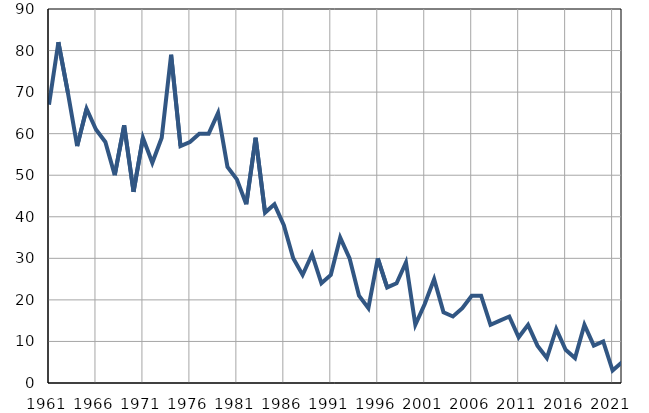
| Category | Умрла 
одојчад |
|---|---|
| 1961.0 | 67 |
| 1962.0 | 82 |
| 1963.0 | 70 |
| 1964.0 | 57 |
| 1965.0 | 66 |
| 1966.0 | 61 |
| 1967.0 | 58 |
| 1968.0 | 50 |
| 1969.0 | 62 |
| 1970.0 | 46 |
| 1971.0 | 59 |
| 1972.0 | 53 |
| 1973.0 | 59 |
| 1974.0 | 79 |
| 1975.0 | 57 |
| 1976.0 | 58 |
| 1977.0 | 60 |
| 1978.0 | 60 |
| 1979.0 | 65 |
| 1980.0 | 52 |
| 1981.0 | 49 |
| 1982.0 | 43 |
| 1983.0 | 59 |
| 1984.0 | 41 |
| 1985.0 | 43 |
| 1986.0 | 38 |
| 1987.0 | 30 |
| 1988.0 | 26 |
| 1989.0 | 31 |
| 1990.0 | 24 |
| 1991.0 | 26 |
| 1992.0 | 35 |
| 1993.0 | 30 |
| 1994.0 | 21 |
| 1995.0 | 18 |
| 1996.0 | 30 |
| 1997.0 | 23 |
| 1998.0 | 24 |
| 1999.0 | 29 |
| 2000.0 | 14 |
| 2001.0 | 19 |
| 2002.0 | 25 |
| 2003.0 | 17 |
| 2004.0 | 16 |
| 2005.0 | 18 |
| 2006.0 | 21 |
| 2007.0 | 21 |
| 2008.0 | 14 |
| 2009.0 | 15 |
| 2010.0 | 16 |
| 2011.0 | 11 |
| 2012.0 | 14 |
| 2013.0 | 9 |
| 2014.0 | 6 |
| 2015.0 | 13 |
| 2016.0 | 8 |
| 2017.0 | 6 |
| 2018.0 | 14 |
| 2019.0 | 9 |
| 2020.0 | 10 |
| 2021.0 | 3 |
| 2022.0 | 5 |